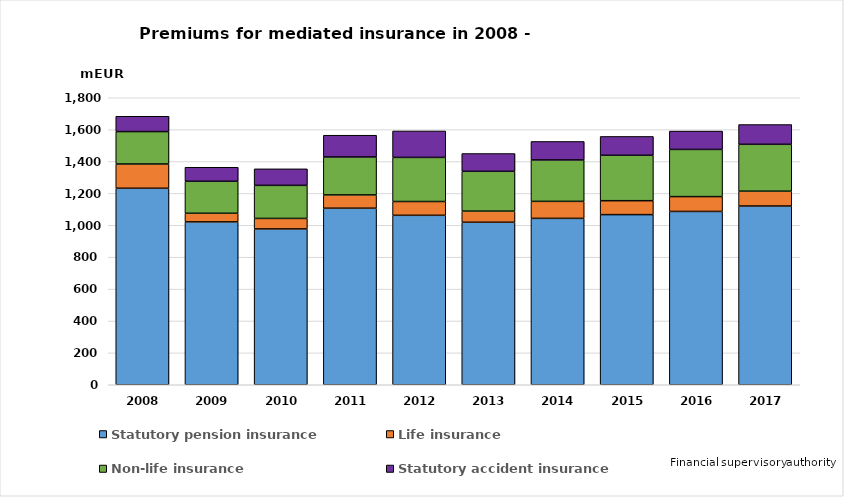
| Category | Statutory pension insurance | Life insurance | Non-life insurance | Statutory accident insurance |
|---|---|---|---|---|
| 2008.0 | 1232.449 | 151.996 | 203.425 | 95.962 |
| 2009.0 | 1021.457 | 54.107 | 200.56 | 88.041 |
| 2010.0 | 977.321 | 65.95 | 207.341 | 103.558 |
| 2011.0 | 1107.329 | 83.403 | 238.041 | 136.289 |
| 2012.0 | 1062.705 | 86.597 | 276.62 | 165.706 |
| 2013.0 | 1019.216 | 69.648 | 249.823 | 111.515 |
| 2014.0 | 1043.573 | 106.619 | 259.835 | 115.957 |
| 2015.0 | 1067.062 | 87.285 | 284.943 | 118.153 |
| 2016.0 | 1087 | 93 | 296 | 115 |
| 2017.0 | 1121 | 93 | 294 | 124 |